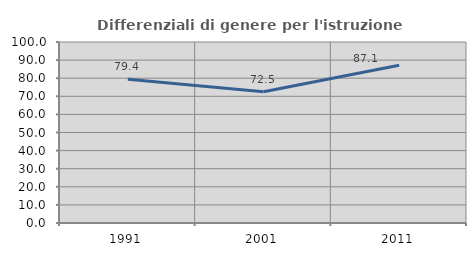
| Category | Differenziali di genere per l'istruzione superiore |
|---|---|
| 1991.0 | 79.419 |
| 2001.0 | 72.495 |
| 2011.0 | 87.136 |